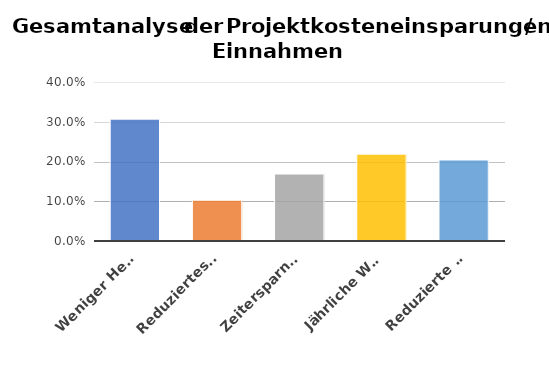
| Category | Series 0 |
|---|---|
| Weniger Helpdesk-Support | 0.307 |
| Reduziertes Büropersonal | 0.103 |
| Zeitersparnis – manuelle Erstellung von Berichten | 0.168 |
| Jährliche Wartungsarbeiten | 0.219 |
| Reduzierte Verbrauchsmaterialien  | 0.204 |